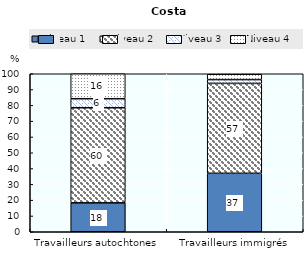
| Category | Niveau 1  | Niveau 2  | Niveau 3  | Niveau 4  |
|---|---|---|---|---|
| Travailleurs autochtones | 18.3 | 60.2 | 5.7 | 15.8 |
| Travailleurs immigrés | 37 | 56.9 | 2.4 | 3.4 |